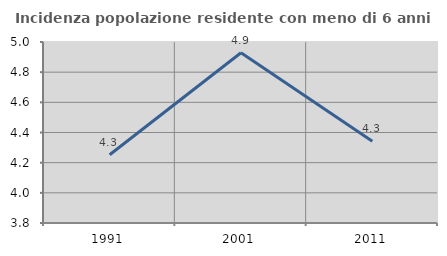
| Category | Incidenza popolazione residente con meno di 6 anni |
|---|---|
| 1991.0 | 4.252 |
| 2001.0 | 4.929 |
| 2011.0 | 4.342 |